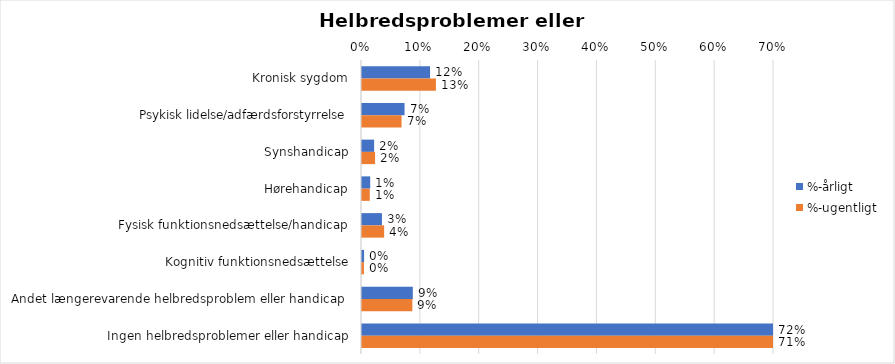
| Category | %-årligt | %-ugentligt |
|---|---|---|
| Kronisk sygdom | 0.116 | 0.126 |
| Psykisk lidelse/adfærdsforstyrrelse | 0.072 | 0.067 |
| Synshandicap | 0.021 | 0.022 |
| Hørehandicap | 0.014 | 0.013 |
| Fysisk funktionsnedsættelse/handicap | 0.034 | 0.038 |
| Kognitiv funktionsnedsættelse | 0.004 | 0.003 |
| Andet længerevarende helbredsproblem eller handicap  | 0.086 | 0.086 |
| Ingen helbredsproblemer eller handicap | 0.719 | 0.712 |